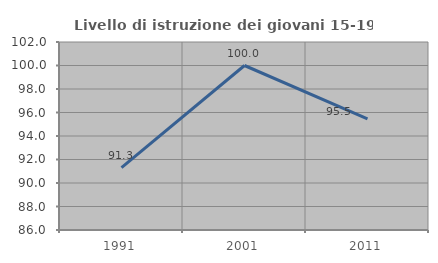
| Category | Livello di istruzione dei giovani 15-19 anni |
|---|---|
| 1991.0 | 91.304 |
| 2001.0 | 100 |
| 2011.0 | 95.455 |